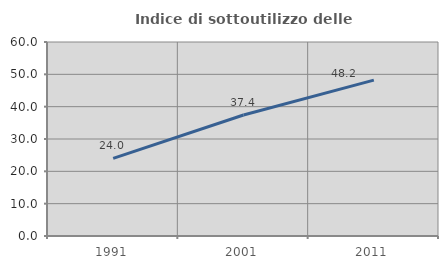
| Category | Indice di sottoutilizzo delle abitazioni  |
|---|---|
| 1991.0 | 24.016 |
| 2001.0 | 37.432 |
| 2011.0 | 48.197 |